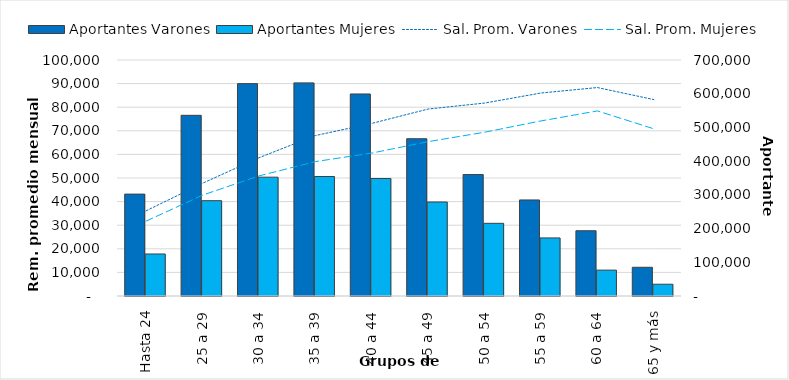
| Category | Aportantes Varones | Aportantes Mujeres |
|---|---|---|
| Hasta 24 | 302261 | 124656 |
| 25 a 29 | 535918 | 282794 |
| 30 a 34 | 629915 | 352472 |
| 35 a 39 | 632132 | 354405 |
| 40 a 44 | 599252 | 348511 |
| 45 a 49 | 466494 | 278826 |
| 50 a 54 | 360265 | 215585 |
| 55 a 59 | 284896 | 172285 |
| 60 a 64 | 193617 | 76784 |
| 65 y más | 85178 | 34906 |